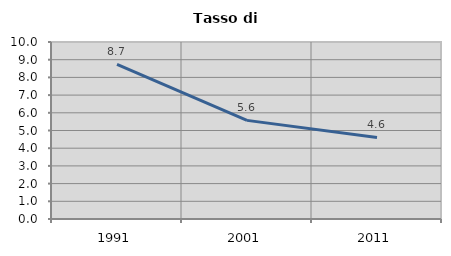
| Category | Tasso di disoccupazione   |
|---|---|
| 1991.0 | 8.735 |
| 2001.0 | 5.573 |
| 2011.0 | 4.605 |